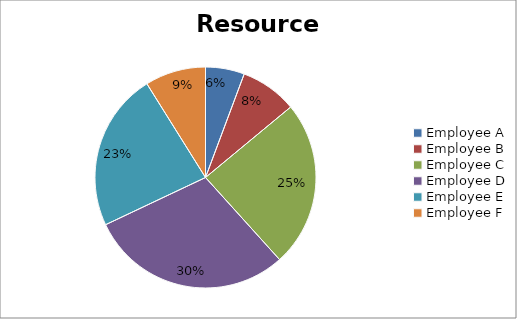
| Category | data |
|---|---|
| Employee A | 720 |
| Employee B | 1050 |
| Employee C | 3075 |
| Employee D | 3750 |
| Employee E | 2925 |
| Employee F | 1125 |